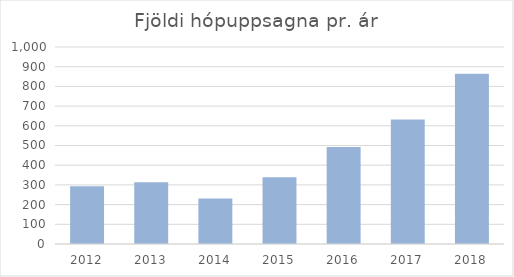
| Category | Series 0 |
|---|---|
| 2012 | 293 |
| 2013 | 314 |
| 2014 | 231 |
| 2015 | 339 |
| 2016 | 493 |
| 2017 | 632 |
| 2018 | 864 |